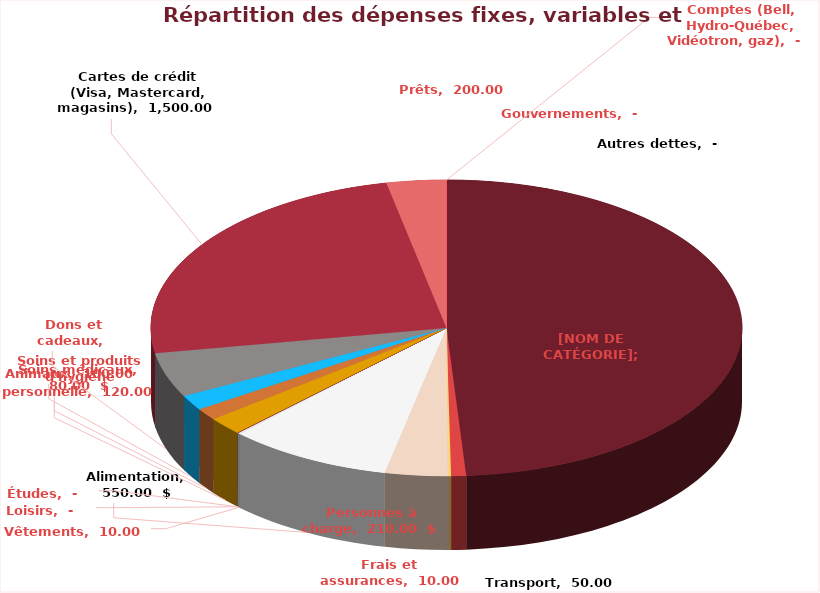
| Category | Series 0 |
|---|---|
| Habitation | 3000 |
| Transport | 50 |
| Frais et assurances | 10 |
| Personnes à charge | 210 |
| Alimentation | 550 |
| Vêtements | 10 |
| Loisirs | 0 |
| Études | 0 |
| Soins et produits d'hygiène personnelle | 120 |
| Soins médicaux | 80 |
| Animaux | 100 |
| Dons et cadeaux | 300 |
| Cartes de crédit (Visa, Mastercard, magasins) | 1500 |
| Prêts | 200 |
| Gouvernements | 0 |
| Comptes (Bell, Hydro-Québec, Vidéotron, gaz) | 0 |
| Autres dettes | 0 |